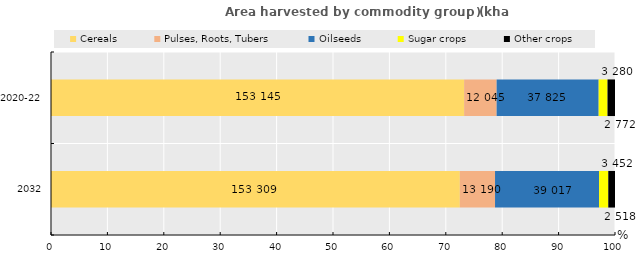
| Category | Cereals | Pulses, Roots, Tubers | Oilseeds | Sugar crops | Other crops |
|---|---|---|---|---|---|
| 2032 | 72.491 | 6.237 | 18.449 | 1.632 | 1.191 |
| 2020-22 | 73.252 | 5.761 | 18.092 | 1.569 | 1.326 |